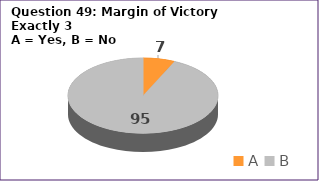
| Category | Series 0 |
|---|---|
| A | 7 |
| B | 95 |